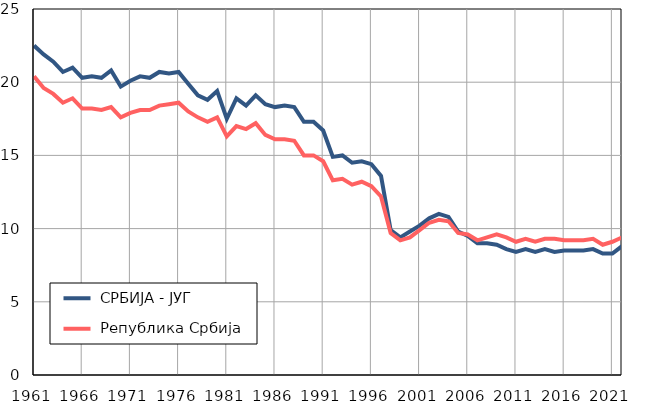
| Category |  СРБИЈА - ЈУГ |  Република Србија |
|---|---|---|
| 1961.0 | 22.5 | 20.4 |
| 1962.0 | 21.9 | 19.6 |
| 1963.0 | 21.4 | 19.2 |
| 1964.0 | 20.7 | 18.6 |
| 1965.0 | 21 | 18.9 |
| 1966.0 | 20.3 | 18.2 |
| 1967.0 | 20.4 | 18.2 |
| 1968.0 | 20.3 | 18.1 |
| 1969.0 | 20.8 | 18.3 |
| 1970.0 | 19.7 | 17.6 |
| 1971.0 | 20.1 | 17.9 |
| 1972.0 | 20.4 | 18.1 |
| 1973.0 | 20.3 | 18.1 |
| 1974.0 | 20.7 | 18.4 |
| 1975.0 | 20.6 | 18.5 |
| 1976.0 | 20.7 | 18.6 |
| 1977.0 | 19.9 | 18 |
| 1978.0 | 19.1 | 17.6 |
| 1979.0 | 18.8 | 17.3 |
| 1980.0 | 19.4 | 17.6 |
| 1981.0 | 17.5 | 16.3 |
| 1982.0 | 18.9 | 17 |
| 1983.0 | 18.4 | 16.8 |
| 1984.0 | 19.1 | 17.2 |
| 1985.0 | 18.5 | 16.4 |
| 1986.0 | 18.3 | 16.1 |
| 1987.0 | 18.4 | 16.1 |
| 1988.0 | 18.3 | 16 |
| 1989.0 | 17.3 | 15 |
| 1990.0 | 17.3 | 15 |
| 1991.0 | 16.7 | 14.6 |
| 1992.0 | 14.9 | 13.3 |
| 1993.0 | 15 | 13.4 |
| 1994.0 | 14.5 | 13 |
| 1995.0 | 14.6 | 13.2 |
| 1996.0 | 14.4 | 12.9 |
| 1997.0 | 13.6 | 12.2 |
| 1998.0 | 9.9 | 9.7 |
| 1999.0 | 9.4 | 9.2 |
| 2000.0 | 9.8 | 9.4 |
| 2001.0 | 10.2 | 9.9 |
| 2002.0 | 10.7 | 10.4 |
| 2003.0 | 11 | 10.6 |
| 2004.0 | 10.8 | 10.5 |
| 2005.0 | 9.8 | 9.7 |
| 2006.0 | 9.5 | 9.6 |
| 2007.0 | 9 | 9.2 |
| 2008.0 | 9 | 9.4 |
| 2009.0 | 8.9 | 9.6 |
| 2010.0 | 8.6 | 9.4 |
| 2011.0 | 8.4 | 9.1 |
| 2012.0 | 8.6 | 9.3 |
| 2013.0 | 8.4 | 9.1 |
| 2014.0 | 8.6 | 9.3 |
| 2015.0 | 8.4 | 9.3 |
| 2016.0 | 8.5 | 9.2 |
| 2017.0 | 8.5 | 9.2 |
| 2018.0 | 8.5 | 9.2 |
| 2019.0 | 8.6 | 9.3 |
| 2020.0 | 8.3 | 8.9 |
| 2021.0 | 8.3 | 9.1 |
| 2022.0 | 8.8 | 9.4 |